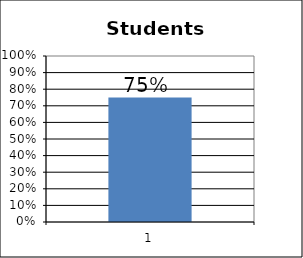
| Category | Percentage of  Students Responding |
|---|---|
| 0 | 0.75 |